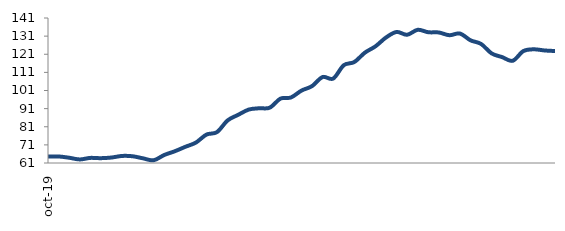
| Category | Series 0 |
|---|---|
| 2019-10-01 | 64.573 |
| 2019-11-01 | 64.608 |
| 2019-12-01 | 63.908 |
| 2020-01-01 | 62.959 |
| 2020-02-01 | 63.811 |
| 2020-03-01 | 63.665 |
| 2020-04-01 | 64.013 |
| 2020-05-01 | 64.885 |
| 2020-06-01 | 64.73 |
| 2020-07-01 | 63.568 |
| 2020-08-01 | 62.507 |
| 2020-09-01 | 65.409 |
| 2020-10-01 | 67.466 |
| 2020-11-01 | 69.929 |
| 2020-12-01 | 72.262 |
| 2021-01-01 | 76.667 |
| 2021-02-01 | 78.05 |
| 2021-03-01 | 84.474 |
| 2021-04-01 | 87.564 |
| 2021-05-01 | 90.47 |
| 2021-06-01 | 91.204 |
| 2021-07-01 | 91.538 |
| 2021-08-01 | 96.497 |
| 2021-09-01 | 97.152 |
| 2021-10-01 | 100.957 |
| 2021-11-01 | 103.422 |
| 2021-12-01 | 108.432 |
| 2022-01-01 | 107.584 |
| 2022-02-01 | 114.937 |
| 2022-03-01 | 116.708 |
| 2022-04-01 | 121.877 |
| 2022-05-01 | 125.358 |
| 2022-06-01 | 130.237 |
| 2022-07-01 | 133.304 |
| 2022-08-01 | 131.751 |
| 2022-09-01 | 134.487 |
| 2022-10-01 | 133.139 |
| 2022-11-01 | 133.012 |
| 2022-12-01 | 131.496 |
| 2023-01-01 | 132.43 |
| 2023-02-01 | 128.69 |
| 2023-03-01 | 126.696 |
| 2023-04-01 | 121.465 |
| 2023-05-01 | 119.417 |
| 2023-06-01 | 117.407 |
| 2023-07-01 | 122.739 |
| 2023-08-01 | 123.725 |
| 2023-09-01 | 123.094 |
| 2023-10-01 | 122.773 |